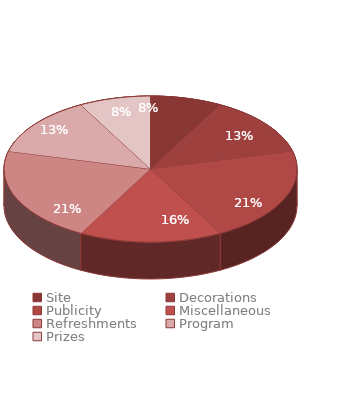
| Category | $3,800.00  |
|---|---|
| Site | 300 |
| Decorations | 500 |
| Publicity | 800 |
| Miscellaneous | 600 |
| Refreshments | 800 |
| Program | 500 |
| Prizes | 300 |